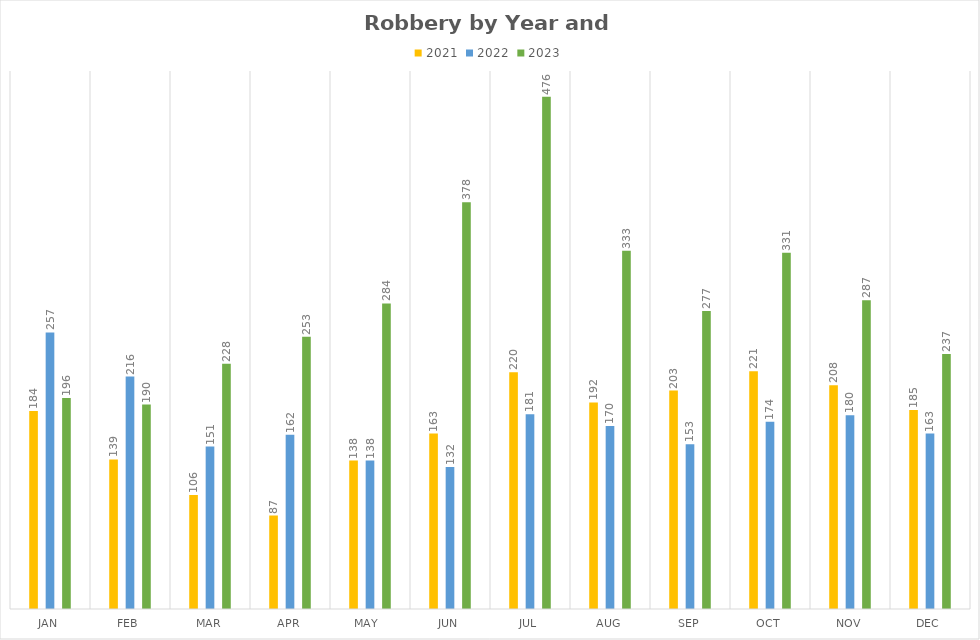
| Category | 2021 | 2022 | 2023 |
|---|---|---|---|
| Jan | 184 | 257 | 196 |
| Feb | 139 | 216 | 190 |
| Mar | 106 | 151 | 228 |
| Apr | 87 | 162 | 253 |
| May  | 138 | 138 | 284 |
| Jun | 163 | 132 | 378 |
| Jul | 220 | 181 | 476 |
| Aug | 192 | 170 | 333 |
| Sep | 203 | 153 | 277 |
| Oct | 221 | 174 | 331 |
| Nov | 208 | 180 | 287 |
| Dec | 185 | 163 | 237 |